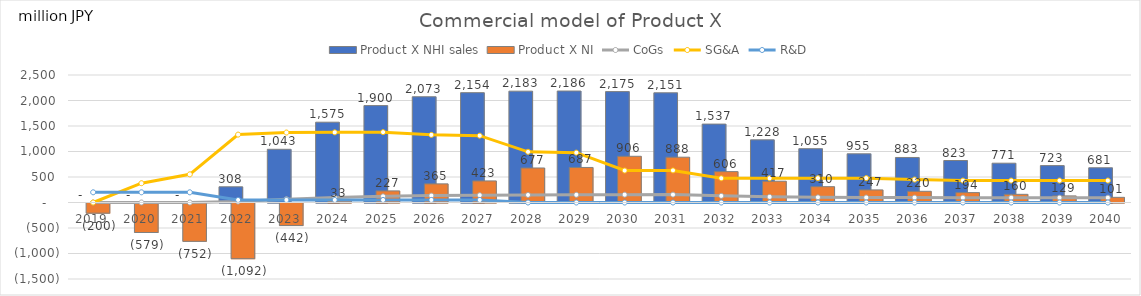
| Category | Product X NHI sales | Product X NI |
|---|---|---|
| 2019.0 | 0 | -200 |
| 2020.0 | 0 | -578.5 |
| 2021.0 | 0 | -752.01 |
| 2022.0 | 307.912 | -1092.027 |
| 2023.0 | 1043.293 | -442.355 |
| 2024.0 | 1574.577 | 32.954 |
| 2025.0 | 1900.396 | 227.454 |
| 2026.0 | 2073.238 | 365.472 |
| 2027.0 | 2153.746 | 422.854 |
| 2028.0 | 2183.202 | 676.816 |
| 2029.0 | 2185.675 | 687.063 |
| 2030.0 | 2174.617 | 906.248 |
| 2031.0 | 2150.742 | 888.291 |
| 2032.0 | 1537.417 | 605.633 |
| 2033.0 | 1228.475 | 417.045 |
| 2034.0 | 1055.283 | 310.195 |
| 2035.0 | 954.696 | 246.803 |
| 2036.0 | 882.688 | 219.538 |
| 2037.0 | 823.291 | 194.163 |
| 2038.0 | 770.696 | 159.977 |
| 2039.0 | 723.437 | 129.084 |
| 2040.0 | 681.029 | 101.164 |